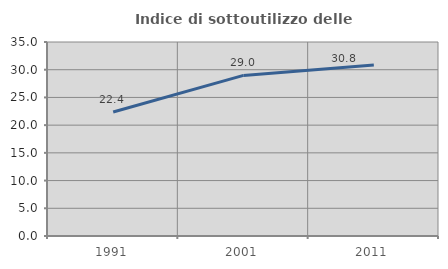
| Category | Indice di sottoutilizzo delle abitazioni  |
|---|---|
| 1991.0 | 22.383 |
| 2001.0 | 28.974 |
| 2011.0 | 30.849 |